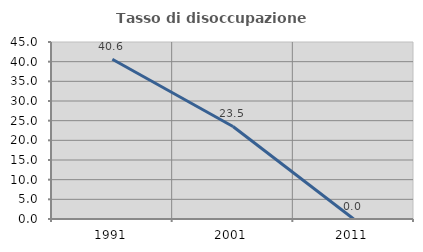
| Category | Tasso di disoccupazione giovanile  |
|---|---|
| 1991.0 | 40.625 |
| 2001.0 | 23.529 |
| 2011.0 | 0 |